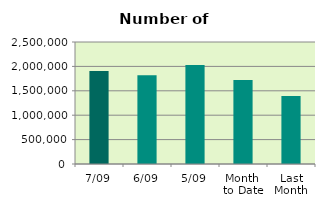
| Category | Series 0 |
|---|---|
| 7/09 | 1904266 |
| 6/09 | 1818832 |
| 5/09 | 2029394 |
| Month 
to Date | 1722777.2 |
| Last
Month | 1391040.957 |